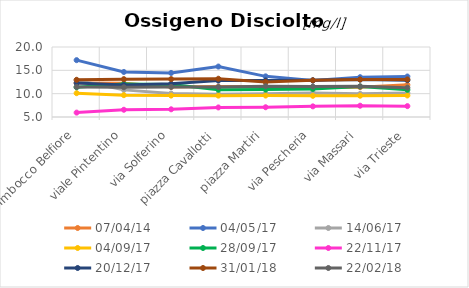
| Category | 07/04/14 | 04/05/17 | 14/06/17 | 04/09/17 | 28/09/17 | 22/11/17 | 20/12/17 | 31/01/18 | 22/02/18 |
|---|---|---|---|---|---|---|---|---|---|
| Imbocco Belfiore | 12.28 | 17.18 | 12.89 | 10.1 | 11.36 | 5.94 | 12.28 | 12.97 | 11.44 |
| viale Pintentino | 12.22 | 14.65 | 10.81 | 9.68 | 12.07 | 6.55 | 11.85 | 13.11 | 11.37 |
| via Solferino | 11.44 | 14.44 | 10.03 | 9.59 | 11.94 | 6.65 | 12.11 | 13.12 | 11.45 |
| piazza Cavallotti | 11.52 | 15.81 | 9.89 | 9.58 | 10.85 | 7.05 | 12.8 | 13.2 | 11.42 |
| piazza Martiri | 11.55 | 13.71 | 9.98 | 9.6 | 10.87 | 7.09 | 12.83 | 12.5 | 11.6 |
| via Pescheria | 11.34 | 12.8 | 10.15 | 9.54 | 11.01 | 7.28 | 12.88 | 12.85 | 11.53 |
| via Massari | 11.39 | 13.53 | 9.96 | 9.56 | 11.55 | 7.42 | 13.01 | 13.02 | 11.57 |
| via Trieste | 11.9 | 13.68 | 10.14 | 9.61 | 10.83 | 7.33 | 12.87 | 13.05 | 11.29 |